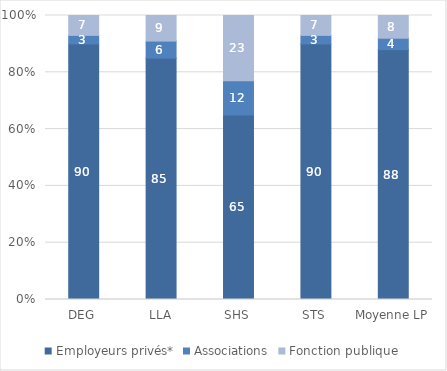
| Category | Employeurs privés* | Associations | Fonction publique |
|---|---|---|---|
| DEG | 90 | 3 | 7 |
| LLA | 85 | 6 | 9 |
| SHS | 65 | 12 | 23 |
| STS | 90 | 3 | 7 |
| Moyenne LP | 88 | 4 | 8 |